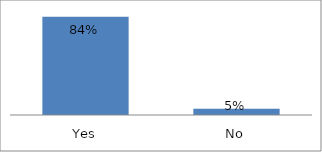
| Category | Series 0 |
|---|---|
| Yes | 0.842 |
| No | 0.053 |